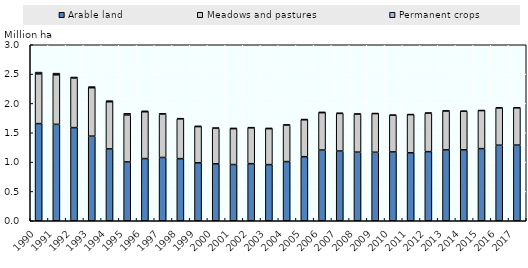
| Category | Arable land | Meadows and pastures | Permanent crops |
|---|---|---|---|
| 1990.0 | 1.656 | 0.848 | 0.03 |
| 1991.0 | 1.644 | 0.844 | 0.028 |
| 1992.0 | 1.588 | 0.843 | 0.02 |
| 1993.0 | 1.442 | 0.825 | 0.02 |
| 1994.0 | 1.225 | 0.803 | 0.02 |
| 1995.0 | 1.002 | 0.8 | 0.029 |
| 1996.0 | 1.06 | 0.798 | 0.016 |
| 1997.0 | 1.079 | 0.738 | 0.015 |
| 1998.0 | 1.059 | 0.678 | 0.012 |
| 1999.0 | 0.987 | 0.618 | 0.012 |
| 2000.0 | 0.97 | 0.606 | 0.012 |
| 2001.0 | 0.958 | 0.611 | 0.012 |
| 2002.0 | 0.973 | 0.61 | 0.012 |
| 2003.0 | 0.957 | 0.613 | 0.012 |
| 2004.0 | 1.009 | 0.621 | 0.012 |
| 2005.0 | 1.092 | 0.629 | 0.013 |
| 2006.0 | 1.205 | 0.637 | 0.013 |
| 2007.0 | 1.188 | 0.641 | 0.01 |
| 2008.0 | 1.17 | 0.648 | 0.007 |
| 2009.0 | 1.168 | 0.659 | 0.006 |
| 2010.0 | 1.174 | 0.625 | 0.007 |
| 2011.0 | 1.158 | 0.651 | 0.007 |
| 2012.0 | 1.178 | 0.656 | 0.006 |
| 2013.0 | 1.208 | 0.663 | 0.006 |
| 2014.0 | 1.209 | 0.657 | 0.006 |
| 2015.0 | 1.23 | 0.648 | 0.007 |
| 2016.0 | 1.288 | 0.635 | 0.008 |
| 2017.0 | 1.29 | 0.635 | 0.008 |